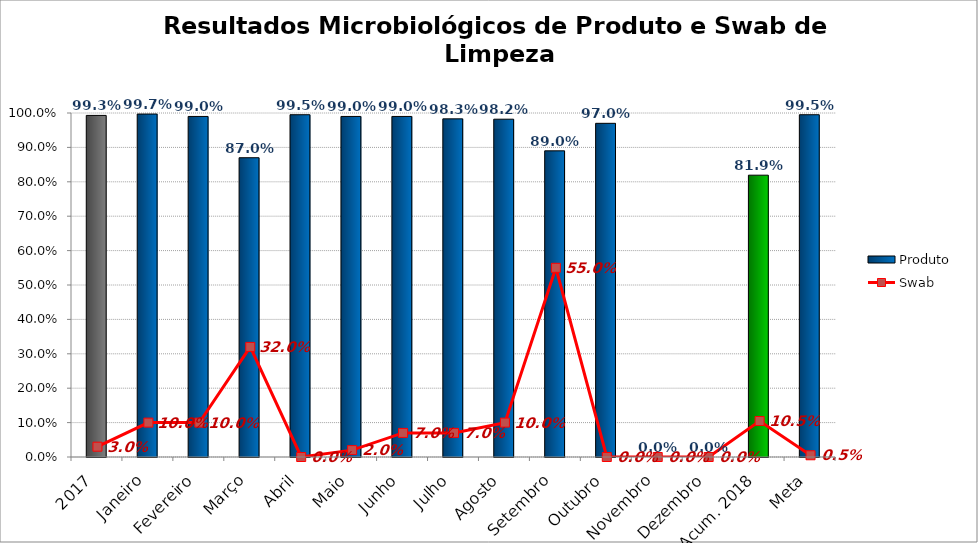
| Category | Produto |
|---|---|
| 2017 | 0.993 |
| Janeiro | 0.997 |
| Fevereiro | 0.99 |
| Março | 0.87 |
| Abril | 0.995 |
| Maio | 0.99 |
| Junho | 0.99 |
| Julho | 0.983 |
| Agosto | 0.982 |
| Setembro | 0.89 |
| Outubro | 0.97 |
| Novembro | 0 |
| Dezembro | 0 |
| Acum. 2018 | 0.819 |
| Meta | 0.995 |